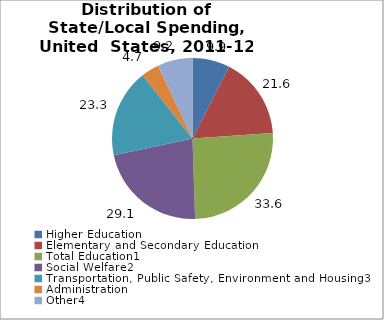
| Category | Series 0 |
|---|---|
| Higher Education | 9.88 |
| Elementary and Secondary Education | 21.558 |
| Total Education1 | 33.605 |
| Social Welfare2 | 29.136 |
| Transportation, Public Safety, Environment and Housing3 | 23.297 |
| Administration | 4.724 |
| Other4 | 9.238 |